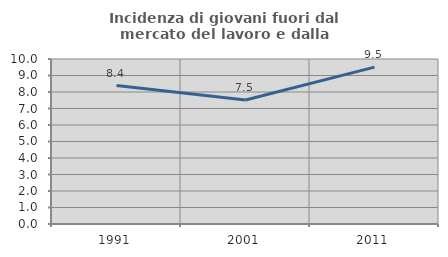
| Category | Incidenza di giovani fuori dal mercato del lavoro e dalla formazione  |
|---|---|
| 1991.0 | 8.387 |
| 2001.0 | 7.514 |
| 2011.0 | 9.506 |